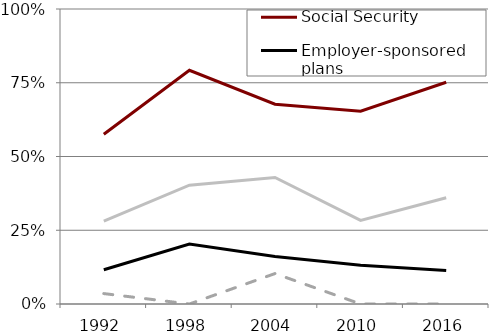
| Category | Social Security | Employer-sponsored plans | Non-DC financial | Housing |
|---|---|---|---|---|
| 1992.0 | 0.576 | 0.116 | 0.035 | 0.281 |
| 1998.0 | 0.792 | 0.203 | 0 | 0.403 |
| 2004.0 | 0.677 | 0.161 | 0.103 | 0.429 |
| 2010.0 | 0.654 | 0.131 | 0 | 0.283 |
| 2016.0 | 0.752 | 0.113 | 0 | 0.36 |